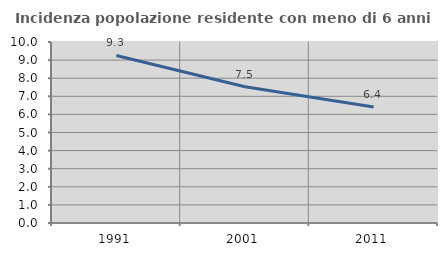
| Category | Incidenza popolazione residente con meno di 6 anni |
|---|---|
| 1991.0 | 9.257 |
| 2001.0 | 7.528 |
| 2011.0 | 6.413 |